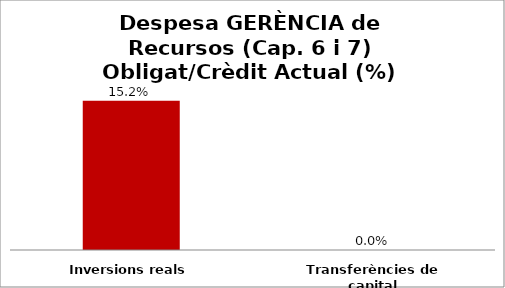
| Category | Series 0 |
|---|---|
| Inversions reals | 0.152 |
| Transferències de capital | 0 |